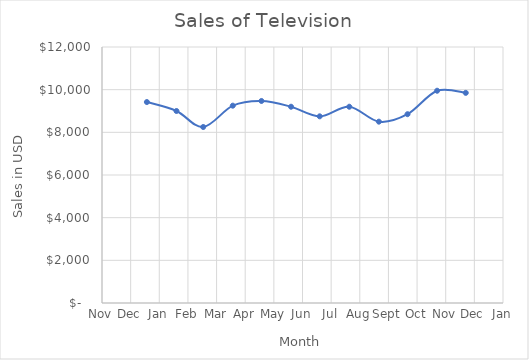
| Category | Sales of Television |
|---|---|
| 44927.0 | 9420 |
| 44958.0 | 9000 |
| 44986.0 | 8250 |
| 45017.0 | 9250 |
| 45047.0 | 9470 |
| 45078.0 | 9200 |
| 45108.0 | 8750 |
| 45139.0 | 9200 |
| 45170.0 | 8500 |
| 45200.0 | 8850 |
| 45231.0 | 9950 |
| 45261.0 | 9850 |